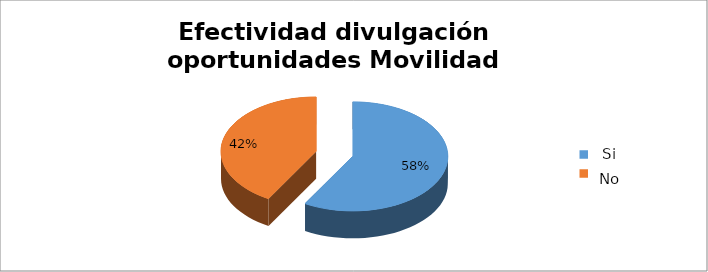
| Category | Series 0 |
|---|---|
| 0 | 0.583 |
| 1 | 0.417 |